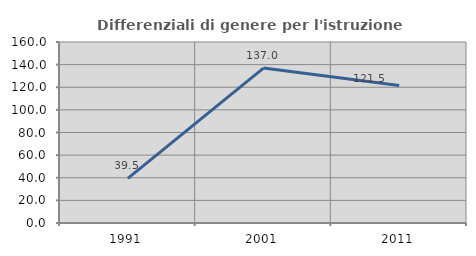
| Category | Differenziali di genere per l'istruzione superiore |
|---|---|
| 1991.0 | 39.506 |
| 2001.0 | 136.957 |
| 2011.0 | 121.483 |